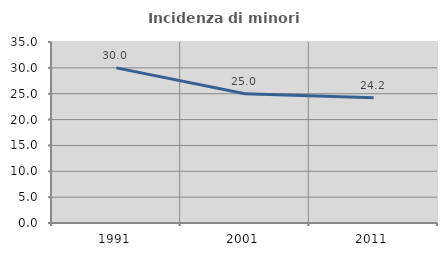
| Category | Incidenza di minori stranieri |
|---|---|
| 1991.0 | 30 |
| 2001.0 | 25 |
| 2011.0 | 24.211 |